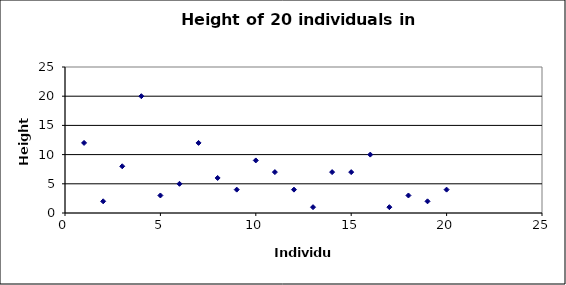
| Category | Height (cm) |
|---|---|
| 1.0 | 12 |
| 2.0 | 2 |
| 3.0 | 8 |
| 4.0 | 20 |
| 5.0 | 3 |
| 6.0 | 5 |
| 7.0 | 12 |
| 8.0 | 6 |
| 9.0 | 4 |
| 10.0 | 9 |
| 11.0 | 7 |
| 12.0 | 4 |
| 13.0 | 1 |
| 14.0 | 7 |
| 15.0 | 7 |
| 16.0 | 10 |
| 17.0 | 1 |
| 18.0 | 3 |
| 19.0 | 2 |
| 20.0 | 4 |